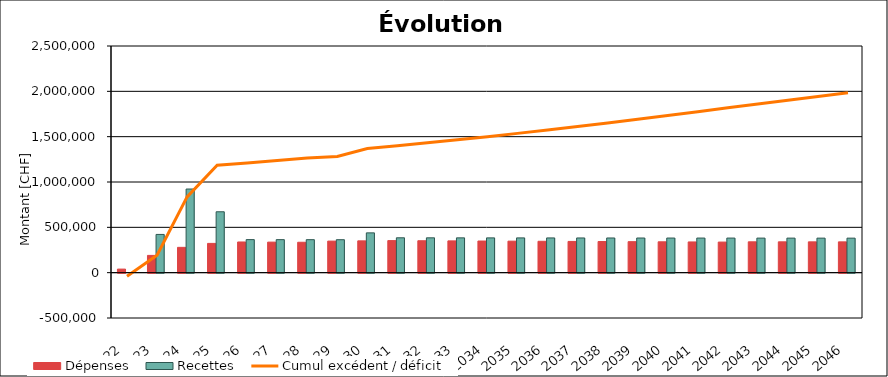
| Category | Dépenses | Recettes |
|---|---|---|
| 2022.0 | 39300 | 0 |
| 2023.0 | 190425.506 | 421767.35 |
| 2024.0 | 279214.179 | 922463.095 |
| 2025.0 | 322768.174 | 671586.746 |
| 2026.0 | 338482.29 | 364479.874 |
| 2027.0 | 336924.305 | 364112.947 |
| 2028.0 | 335372.451 | 363755.241 |
| 2029.0 | 348170.015 | 363406.747 |
| 2030.0 | 350925.636 | 439044.667 |
| 2031.0 | 353644.506 | 384676.088 |
| 2032.0 | 352109.12 | 384340.036 |
| 2033.0 | 350580.22 | 384013.715 |
| 2034.0 | 349057.8 | 383697.114 |
| 2035.0 | 347541.853 | 383390.225 |
| 2036.0 | 346032.373 | 383093.04 |
| 2037.0 | 344529.352 | 382805.551 |
| 2038.0 | 343317.622 | 382527.748 |
| 2039.0 | 341827.502 | 382259.626 |
| 2040.0 | 340343.824 | 382001.176 |
| 2041.0 | 338866.583 | 381752.391 |
| 2042.0 | 337395.771 | 381513.264 |
| 2043.0 | 340284.551 | 381283.788 |
| 2044.0 | 340101.584 | 381063.956 |
| 2045.0 | 339925.032 | 380853.764 |
| 2046.0 | 339754.89 | 380653.203 |